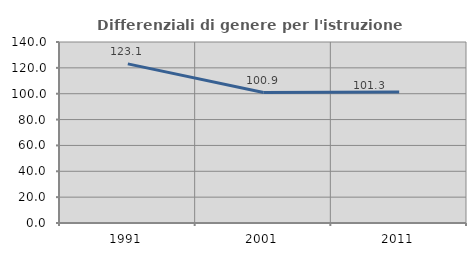
| Category | Differenziali di genere per l'istruzione superiore |
|---|---|
| 1991.0 | 123.071 |
| 2001.0 | 100.903 |
| 2011.0 | 101.276 |